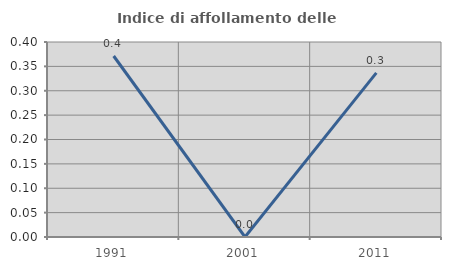
| Category | Indice di affollamento delle abitazioni  |
|---|---|
| 1991.0 | 0.371 |
| 2001.0 | 0 |
| 2011.0 | 0.337 |